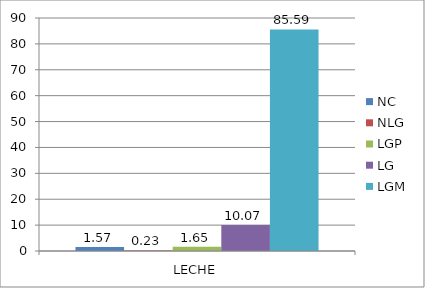
| Category | NC | NLG | LGP | LG | LGM |
|---|---|---|---|---|---|
| 0 | 1.57 | 0.23 | 1.65 | 10.07 | 85.59 |